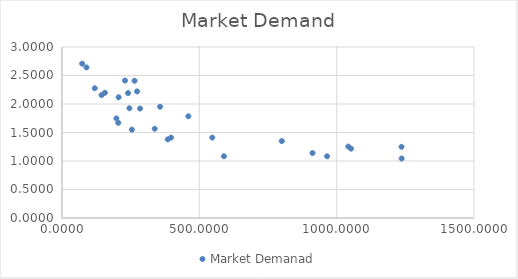
| Category | Market Demanad |
|---|---|
| 240.51146013371977 | 2.191 |
| 396.8665890615075 | 1.411 |
| 965.13334379998 | 1.082 |
| 264.23886761775674 | 2.407 |
| 1236.1190867448317 | 1.249 |
| 589.6355697263458 | 1.083 |
| 384.83414072484675 | 1.379 |
| 357.00362607131154 | 1.952 |
| 1042.5038063243776 | 1.254 |
| 547.0652685183336 | 1.411 |
| 204.82613874491253 | 1.67 |
| 245.4149415200215 | 1.925 |
| 1236.4960762642918 | 1.044 |
| 206.10852181926793 | 2.118 |
| 254.31735297308214 | 1.55 |
| 284.2526666877699 | 1.92 |
| 337.52964799973245 | 1.566 |
| 143.95885275273258 | 2.157 |
| 89.0873751276123 | 2.642 |
| 273.23518148867817 | 2.22 |
| 119.3307590058541 | 2.277 |
| 800.2510312289119 | 1.35 |
| 197.99007951651123 | 1.748 |
| 1052.0547498252777 | 1.216 |
| 459.989742949789 | 1.785 |
| 912.099048135545 | 1.139 |
| 73.34763325414481 | 2.707 |
| 229.39934211014383 | 2.412 |
| 156.14823072337393 | 2.196 |